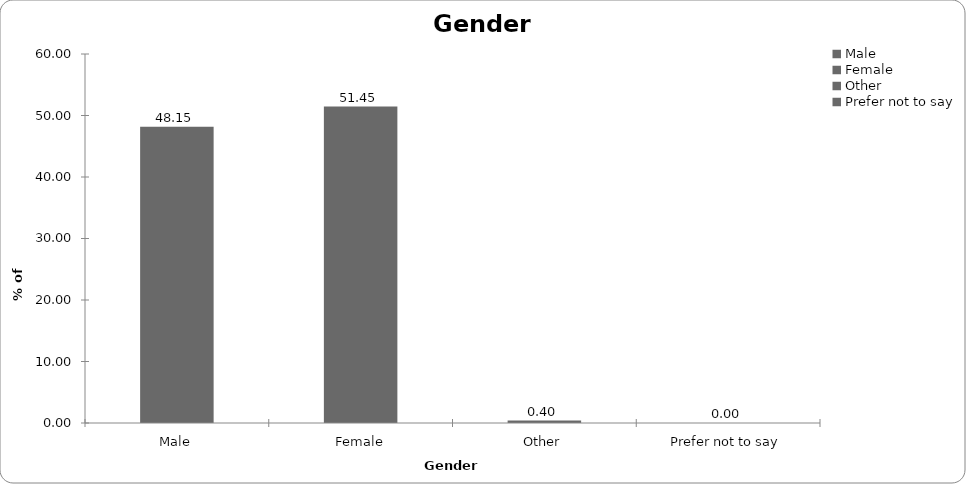
| Category | Series 0 |
|---|---|
| Male | 48.152 |
| Female | 51.449 |
| Other | 0.4 |
| Prefer not to say | 0 |